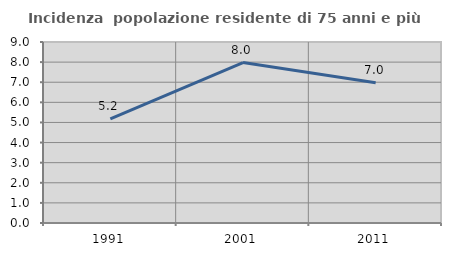
| Category | Incidenza  popolazione residente di 75 anni e più |
|---|---|
| 1991.0 | 5.178 |
| 2001.0 | 7.975 |
| 2011.0 | 6.977 |